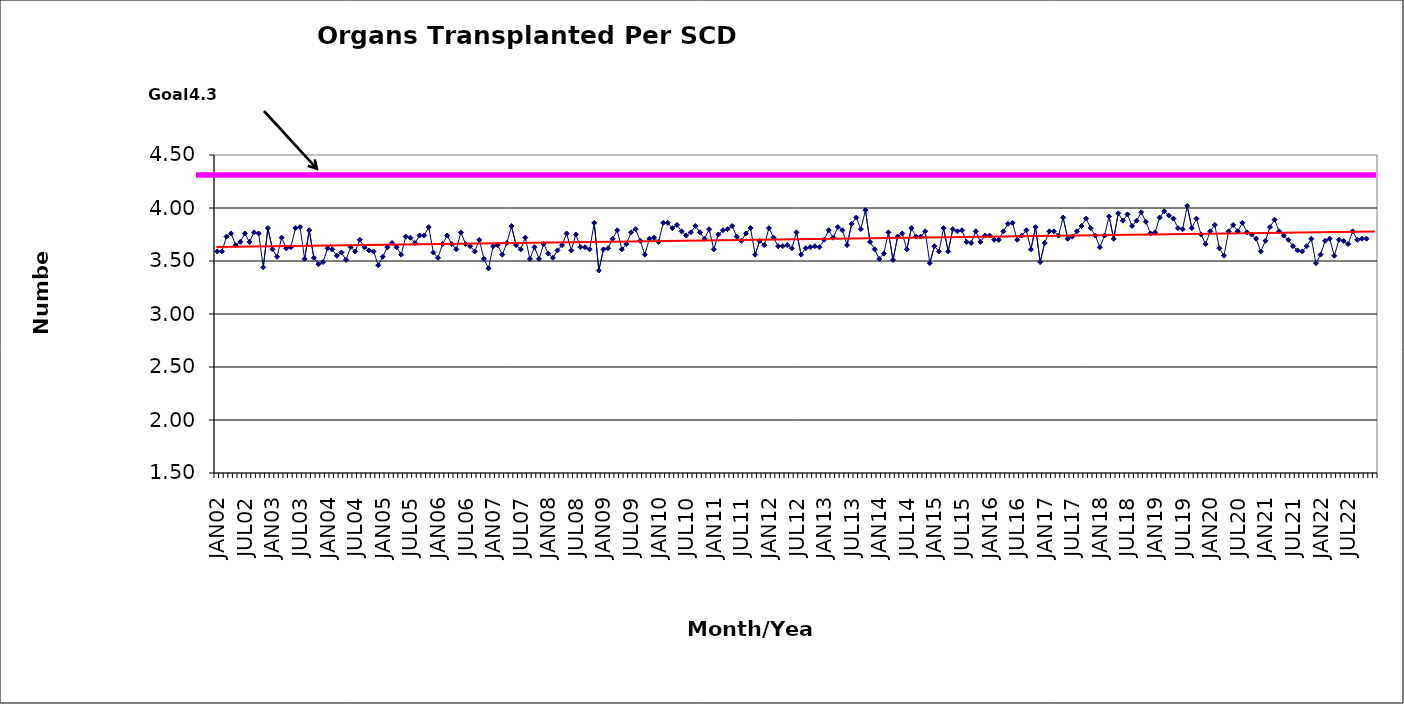
| Category | Series 0 |
|---|---|
| JAN02 | 3.59 |
| FEB02 | 3.59 |
| MAR02 | 3.73 |
| APR02 | 3.76 |
| MAY02 | 3.65 |
| JUN02 | 3.68 |
| JUL02 | 3.76 |
| AUG02 | 3.68 |
| SEP02 | 3.77 |
| OCT02 | 3.76 |
| NOV02 | 3.44 |
| DEC02 | 3.81 |
| JAN03 | 3.61 |
| FEB03 | 3.54 |
| MAR03 | 3.72 |
| APR03 | 3.62 |
| MAY03 | 3.63 |
| JUN03 | 3.81 |
| JUL03 | 3.82 |
| AUG03 | 3.52 |
| SEP03 | 3.79 |
| OCT03 | 3.53 |
| NOV03 | 3.47 |
| DEC03 | 3.49 |
| JAN04 | 3.62 |
| FEB04 | 3.61 |
| MAR04 | 3.55 |
| APR04 | 3.58 |
| MAY04 | 3.51 |
| JUN04 | 3.63 |
| JUL04 | 3.59 |
| AUG04 | 3.7 |
| SEP04 | 3.63 |
| OCT04 | 3.6 |
| NOV04 | 3.59 |
| DEC04 | 3.46 |
| JAN05 | 3.54 |
| FEB05 | 3.63 |
| MAR05 | 3.67 |
| APR05 | 3.63 |
| MAY05 | 3.56 |
| JUN05 | 3.73 |
| JUL05 | 3.72 |
| AUG05 | 3.67 |
| SEP05 | 3.74 |
| OCT05 | 3.74 |
| NOV05 | 3.82 |
| DEC05 | 3.58 |
| JAN06 | 3.53 |
| FEB06 | 3.66 |
| MAR06 | 3.74 |
| APR06 | 3.66 |
| MAY06 | 3.61 |
| JUN06 | 3.77 |
| JUL06 | 3.66 |
| AUG06 | 3.64 |
| SEP06 | 3.59 |
| OCT06 | 3.7 |
| NOV06 | 3.52 |
| DEC06 | 3.43 |
| JAN07 | 3.64 |
| FEB07 | 3.65 |
| MAR07 | 3.56 |
| APR07 | 3.67 |
| MAY07 | 3.83 |
| JUN07 | 3.65 |
| JUL07 | 3.61 |
| AUG07 | 3.72 |
| SEP07 | 3.52 |
| OCT07 | 3.63 |
| NOV07 | 3.52 |
| DEC07 | 3.66 |
| JAN08 | 3.57 |
| FEB08 | 3.53 |
| MAR08 | 3.6 |
| APR08 | 3.65 |
| MAY08 | 3.76 |
| JUN08 | 3.6 |
| JUL08 | 3.75 |
| AUG08 | 3.63 |
| SEP08 | 3.63 |
| OCT08 | 3.61 |
| NOV08 | 3.86 |
| DEC08 | 3.41 |
| JAN09 | 3.61 |
| FEB09 | 3.62 |
| MAR09 | 3.71 |
| APR09 | 3.79 |
| MAY09 | 3.61 |
| JUN09 | 3.66 |
| JUL09 | 3.77 |
| AUG09 | 3.8 |
| SEP09 | 3.69 |
| OCT09 | 3.56 |
| NOV09 | 3.71 |
| DEC09 | 3.72 |
| JAN10 | 3.68 |
| FEB10 | 3.86 |
| MAR10 | 3.86 |
| APR10 | 3.81 |
| MAY10 | 3.84 |
| JUN10 | 3.78 |
| JUL10 | 3.74 |
| AUG10 | 3.77 |
| SEP10 | 3.83 |
| OCT10 | 3.77 |
| NOV10 | 3.71 |
| DEC10 | 3.8 |
| JAN11 | 3.61 |
| FEB11 | 3.75 |
| MAR11 | 3.79 |
| APR11 | 3.8 |
| MAY11 | 3.83 |
| JUN11 | 3.73 |
| JUL11 | 3.69 |
| AUG11 | 3.76 |
| SEP11 | 3.81 |
| OCT11 | 3.56 |
| NOV11 | 3.69 |
| DEC11 | 3.65 |
| JAN12 | 3.81 |
| FEB12 | 3.72 |
| MAR12 | 3.64 |
| APR12 | 3.64 |
| MAY12 | 3.65 |
| JUN12 | 3.62 |
| JUL12 | 3.77 |
| AUG12 | 3.56 |
| SEP12 | 3.62 |
| OCT12 | 3.63 |
| NOV12 | 3.64 |
| DEC12 | 3.63 |
| JAN13 | 3.7 |
| FEB13 | 3.79 |
| MAR13 | 3.72 |
| APR13 | 3.82 |
| MAY13 | 3.79 |
| JUN13 | 3.65 |
| JUL13 | 3.85 |
| AUG13 | 3.91 |
| SEP13 | 3.8 |
| OCT13 | 3.98 |
| NOV13 | 3.68 |
| DEC13 | 3.61 |
| JAN14 | 3.52 |
| FEB14 | 3.57 |
| MAR14 | 3.77 |
| APR14 | 3.51 |
| MAY14 | 3.73 |
| JUN14 | 3.76 |
| JUL14 | 3.61 |
| AUG14 | 3.81 |
| SEP14 | 3.73 |
| OCT14 | 3.73 |
| NOV14 | 3.78 |
| DEC14 | 3.48 |
| JAN15 | 3.64 |
| FEB15 | 3.59 |
| MAR15 | 3.81 |
| APR15 | 3.59 |
| MAY15 | 3.8 |
| JUN15 | 3.78 |
| JUL15 | 3.79 |
| AUG15 | 3.68 |
| SEP15 | 3.67 |
| OCT15 | 3.78 |
| NOV15 | 3.68 |
| DEC15 | 3.74 |
| JAN16 | 3.74 |
| FEB16 | 3.7 |
| MAR16 | 3.7 |
| APR16 | 3.78 |
| MAY16 | 3.85 |
| JUN16 | 3.86 |
| JUL16 | 3.7 |
| AUG16 | 3.74 |
| SEP16 | 3.79 |
| OCT16 | 3.61 |
| NOV16 | 3.82 |
| DEC16 | 3.49 |
| JAN17 | 3.67 |
| FEB17 | 3.78 |
| MAR17 | 3.78 |
| APR17 | 3.74 |
| MAY17 | 3.91 |
| JUN17 | 3.71 |
| JUL17 | 3.73 |
| AUG17 | 3.78 |
| SEP17 | 3.83 |
| OCT17 | 3.9 |
| NOV17 | 3.81 |
| DEC17 | 3.74 |
| JAN18 | 3.63 |
| FEB18 | 3.74 |
| MAR18 | 3.92 |
| APR18 | 3.71 |
| MAY18 | 3.95 |
| JUN18 | 3.88 |
| JUL18 | 3.94 |
| AUG18 | 3.83 |
| SEP18 | 3.88 |
| OCT18 | 3.96 |
| NOV18 | 3.87 |
| DEC18 | 3.76 |
| JAN19 | 3.77 |
| FEB19 | 3.91 |
| MAR19 | 3.97 |
| APR19 | 3.93 |
| MAY19 | 3.9 |
| JUN19 | 3.81 |
| JUL19 | 3.8 |
| AUG19 | 4.02 |
| SEP19 | 3.81 |
| OCT19 | 3.9 |
| NOV19 | 3.75 |
| DEC19 | 3.66 |
| JAN20 | 3.78 |
| FEB20 | 3.84 |
| MAR20 | 3.62 |
| APR20 | 3.55 |
| MAY20 | 3.78 |
| JUN20 | 3.84 |
| JUL20 | 3.78 |
| AUG20 | 3.86 |
| SEP20 | 3.77 |
| OCT20 | 3.75 |
| NOV20 | 3.71 |
| DEC20 | 3.59 |
| JAN21 | 3.69 |
| FEB21 | 3.82 |
| MAR21 | 3.89 |
| APR21 | 3.78 |
| MAY21 | 3.74 |
| JUN21 | 3.7 |
| JUL21 | 3.64 |
| AUG21 | 3.6 |
| SEP21 | 3.59 |
| OCT21 | 3.64 |
| NOV21 | 3.71 |
| DEC21 | 3.48 |
| JAN22 | 3.56 |
| FEB22 | 3.69 |
| MAR22 | 3.71 |
| APR22 | 3.55 |
| MAY22 | 3.7 |
| JUN22 | 3.69 |
| JUL22 | 3.66 |
| AUG22 | 3.78 |
| SEP22 | 3.7 |
| OCT22 | 3.71 |
| NOV22 | 3.71 |